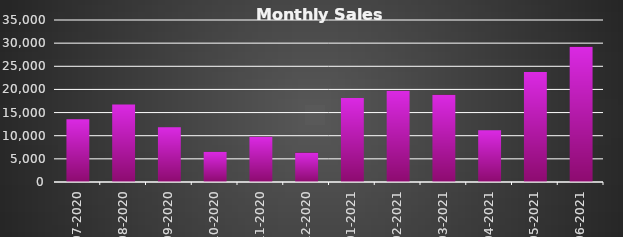
| Category |  Sales  |
|---|---|
| 2020-07-31 | 13570 |
| 2020-08-31 | 16750 |
| 2020-09-30 | 11820 |
| 2020-10-31 | 6525 |
| 2020-11-30 | 9775 |
| 2020-12-31 | 6352 |
| 2021-01-31 | 18124 |
| 2021-02-28 | 19730 |
| 2021-03-31 | 18830 |
| 2021-04-30 | 11156 |
| 2021-05-31 | 23790 |
| 2021-06-30 | 29220 |